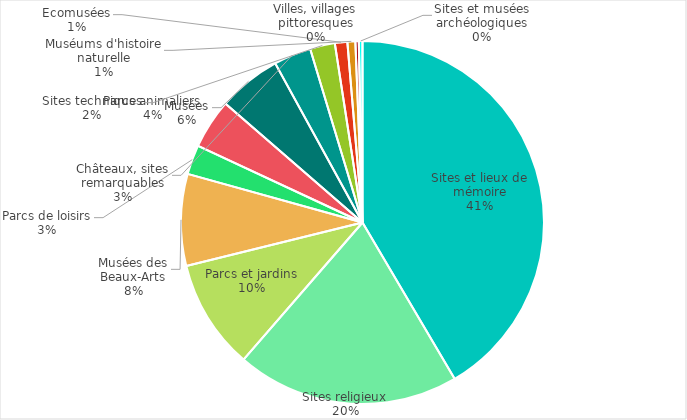
| Category | Series 0 |
|---|---|
| Sites et lieux de mémoire | 0.412 |
| Sites religieux | 0.197 |
| Parcs et jardins | 0.097 |
| Musées des Beaux-Arts | 0.081 |
| Parcs de loisirs | 0.026 |
| Parcs animaliers | 0.044 |
| Musées | 0.056 |
| Châteaux, sites remarquables | 0.033 |
| Sites techniques | 0.022 |
| Ecomusées | 0.011 |
| Muséums d'histoire naturelle | 0.007 |
| Villes, villages pittoresques | 0.003 |
| Sites et musées archéologiques | 0.003 |